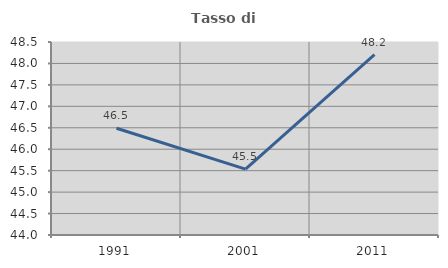
| Category | Tasso di occupazione   |
|---|---|
| 1991.0 | 46.49 |
| 2001.0 | 45.537 |
| 2011.0 | 48.204 |